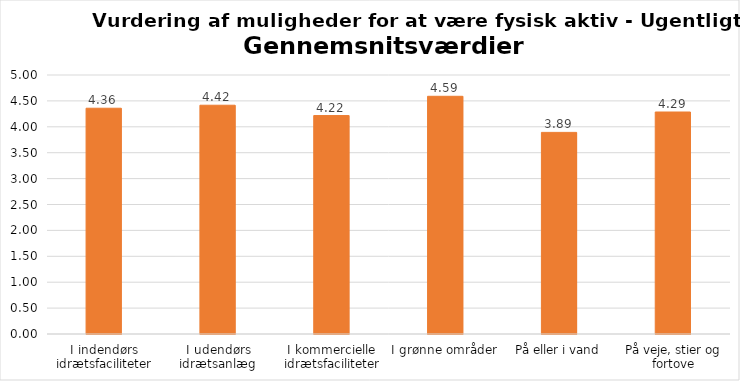
| Category | Gennemsnit |
|---|---|
| I indendørs idrætsfaciliteter | 4.358 |
| I udendørs idrætsanlæg | 4.416 |
| I kommercielle idrætsfaciliteter | 4.217 |
| I grønne områder | 4.589 |
| På eller i vand | 3.892 |
| På veje, stier og fortove | 4.286 |